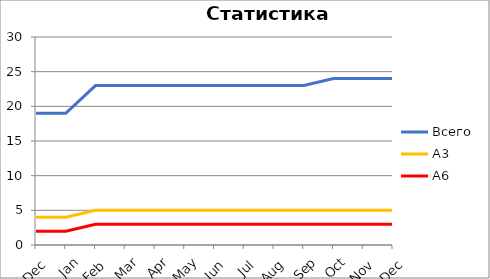
| Category | Всего | А3 | A6 |
|---|---|---|---|
| 0 | 19 | 4 | 2 |
| 1 | 19 | 4 | 2 |
| 2 | 23 | 5 | 3 |
| 3 | 23 | 5 | 3 |
| 4 | 23 | 5 | 3 |
| 5 | 23 | 5 | 3 |
| 6 | 23 | 5 | 3 |
| 7 | 23 | 5 | 3 |
| 8 | 23 | 5 | 3 |
| 9 | 23 | 5 | 3 |
| 10 | 24 | 5 | 3 |
| 11 | 24 | 5 | 3 |
| 12 | 24 | 5 | 3 |